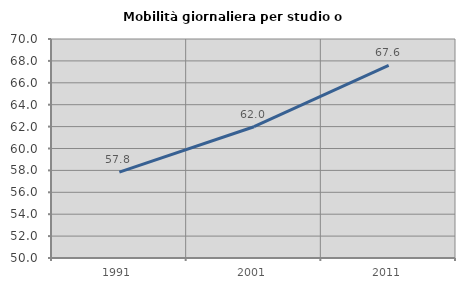
| Category | Mobilità giornaliera per studio o lavoro |
|---|---|
| 1991.0 | 57.84 |
| 2001.0 | 61.989 |
| 2011.0 | 67.589 |